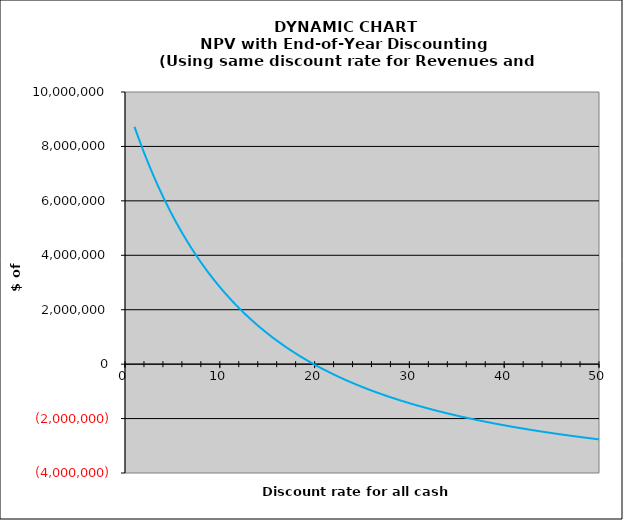
| Category | Series 0 |
|---|---|
| 0 | 8720866.982 |
| 1 | 7777398.021 |
| 2 | 6927844.403 |
| 3 | 6161029.429 |
| 4 | 5467270.219 |
| 5 | 4838159.935 |
| 6 | 4266384.056 |
| 7 | 3745565.078 |
| 8 | 3270130.944 |
| 9 | 2835203.363 |
| 10 | 2436502.814 |
| 11 | 2070267.581 |
| 12 | 1733184.61 |
| 13 | 1422330.347 |
| 14 | 1135120.021 |
| 15 | 869264.083 |
| 16 | 622730.723 |
| 17 | 393713.552 |
| 18 | 180603.699 |
| 19 | -18034.336 |
| 20 | -203483.613 |
| 21 | -376892.914 |
| 22 | -539292.554 |
| 23 | -691608.139 |
| 24 | -834672.584 |
| 25 | -969236.613 |
| 26 | -1095977.95 |
| 27 | -1215509.384 |
| 28 | -1328385.847 |
| 29 | -1435110.644 |
| 30 | -1536140.938 |
| 31 | -1631892.598 |
| 32 | -1722744.471 |
| 33 | -1809042.174 |
| 34 | -1891101.451 |
| 35 | -1969211.148 |
| 36 | -2043635.864 |
| 37 | -2114618.311 |
| 38 | -2182381.41 |
| 39 | -2247130.17 |
| 40 | -2309053.362 |
| 41 | -2368325.025 |
| 42 | -2425105.8 |
| 43 | -2479544.149 |
| 44 | -2531777.43 |
| 45 | -2581932.874 |
| 46 | -2630128.469 |
| 47 | -2676473.743 |
| 48 | -2721070.488 |
| 49 | -2764013.403 |